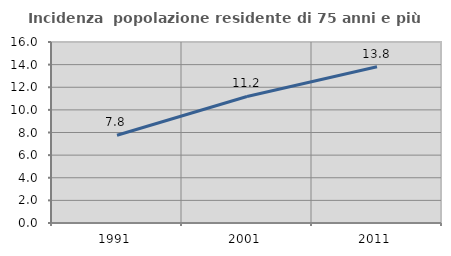
| Category | Incidenza  popolazione residente di 75 anni e più |
|---|---|
| 1991.0 | 7.756 |
| 2001.0 | 11.183 |
| 2011.0 | 13.817 |